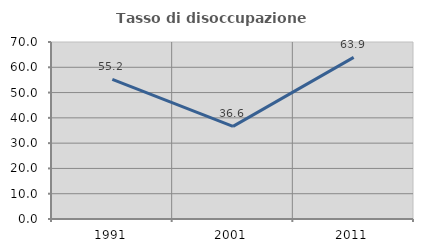
| Category | Tasso di disoccupazione giovanile  |
|---|---|
| 1991.0 | 55.245 |
| 2001.0 | 36.62 |
| 2011.0 | 63.934 |